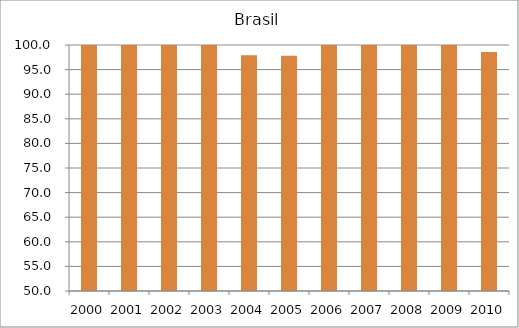
| Category | Brasil |
|---|---|
| 2000.0 | 101.4 |
| 2001.0 | 102.8 |
| 2002.0 | 100 |
| 2003.0 | 100.5 |
| 2004.0 | 97.9 |
| 2005.0 | 97.8 |
| 2006.0 | 102 |
| 2007.0 | 104.9 |
| 2008.0 | 100.1 |
| 2009.0 | 100.9 |
| 2010.0 | 98.58 |